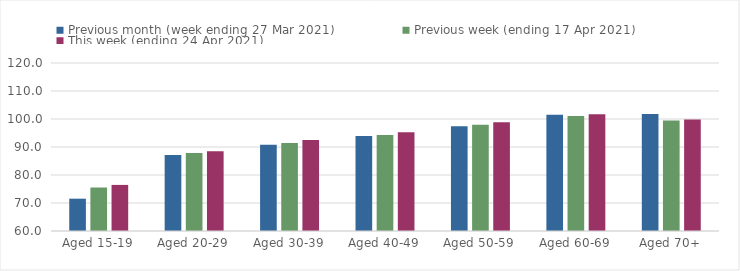
| Category | Previous month (week ending 27 Mar 2021) | Previous week (ending 17 Apr 2021) | This week (ending 24 Apr 2021) |
|---|---|---|---|
| Aged 15-19 | 71.54 | 75.53 | 76.46 |
| Aged 20-29 | 87.1 | 87.83 | 88.45 |
| Aged 30-39 | 90.83 | 91.4 | 92.48 |
| Aged 40-49 | 93.97 | 94.32 | 95.31 |
| Aged 50-59 | 97.39 | 97.95 | 98.81 |
| Aged 60-69 | 101.48 | 101.07 | 101.69 |
| Aged 70+ | 101.8 | 99.5 | 99.85 |